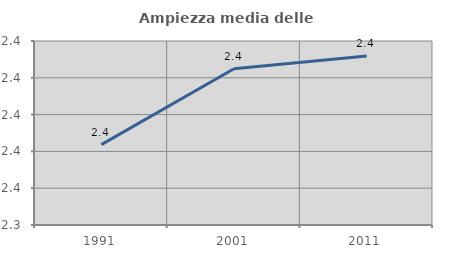
| Category | Ampiezza media delle famiglie |
|---|---|
| 1991.0 | 2.384 |
| 2001.0 | 2.425 |
| 2011.0 | 2.432 |